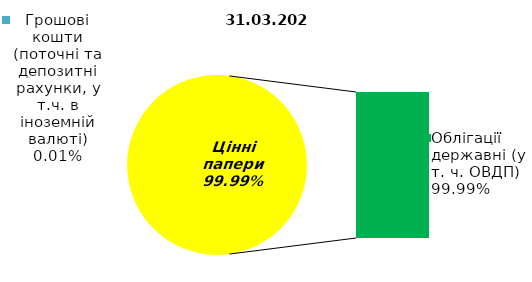
| Category | Series 0 |
|---|---|
| Грошові кошти (поточні та депозитні рахунки, у т.ч. в іноземній валюті) | 0.01 |
| Банківські метали | 0 |
| Нерухомість | 0 |
| Інші активи | 0 |
| Акції | 0 |
| Облігації підприємств | 0 |
| Муніципальні облігації | 0 |
| Облігації державні (у т. ч. ОВДП) | 131.14 |
| Іпотечні сертифікати | 0 |